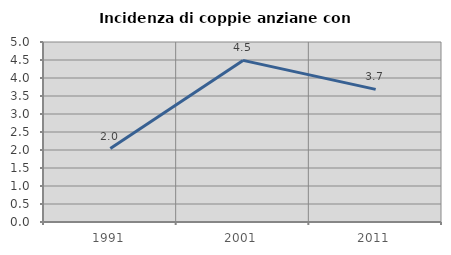
| Category | Incidenza di coppie anziane con figli |
|---|---|
| 1991.0 | 2.039 |
| 2001.0 | 4.49 |
| 2011.0 | 3.685 |